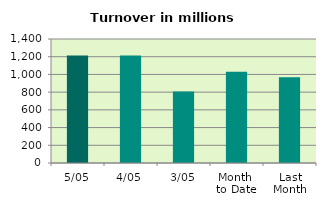
| Category | Series 0 |
|---|---|
| 5/05 | 1213.294 |
| 4/05 | 1213.413 |
| 3/05 | 806.55 |
| Month 
to Date | 1031.241 |
| Last
Month | 968.247 |